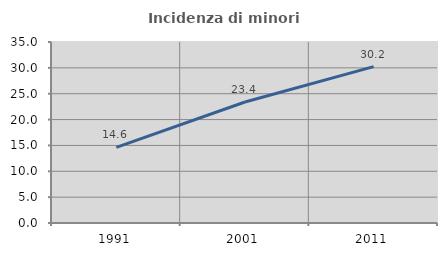
| Category | Incidenza di minori stranieri |
|---|---|
| 1991.0 | 14.621 |
| 2001.0 | 23.399 |
| 2011.0 | 30.233 |